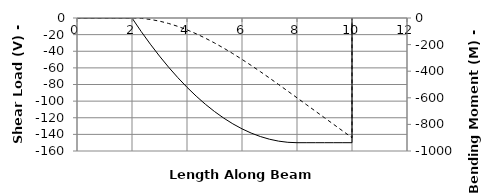
| Category | V |
|---|---|
| 0.0 | 0 |
| 0.0 | 0 |
| 0.3333333333333333 | 0 |
| 0.6666666666666666 | 0 |
| 1.0 | 0 |
| 1.3333333333333333 | 0 |
| 1.6666666666666665 | 0 |
| 2.0 | 0 |
| 2.0 | 0 |
| 2.333333333333333 | -16.204 |
| 2.6666666666666665 | -31.481 |
| 3.0 | -45.833 |
| 3.333333333333333 | -59.259 |
| 3.6666666666666665 | -71.759 |
| 4.0 | -83.333 |
| 4.333333333333333 | -93.981 |
| 4.666666666666666 | -103.704 |
| 5.0 | -112.5 |
| 5.333333333333333 | -120.37 |
| 5.666666666666666 | -127.315 |
| 6.0 | -133.333 |
| 6.333333333333333 | -138.426 |
| 6.666666666666666 | -142.593 |
| 7.0 | -145.833 |
| 7.333333333333333 | -148.148 |
| 7.666666666666666 | -149.537 |
| 8.0 | -150 |
| 8.0 | -150 |
| 8.333333333333332 | -150 |
| 8.666666666666666 | -150 |
| 9.0 | -150 |
| 9.333333333333332 | -150 |
| 9.666666666666666 | -150 |
| 10.0 | -150 |
| 10.0 | 0 |